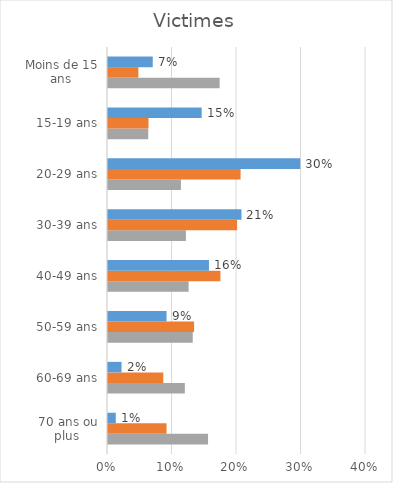
| Category | Victimes  |
|---|---|
| 70 ans ou plus  | 0.012 |
| 60-69 ans | 0.021 |
| 50-59 ans | 0.091 |
| 40-49 ans | 0.157 |
| 30-39 ans | 0.207 |
| 20-29 ans | 0.298 |
| 15-19 ans | 0.145 |
| Moins de 15 ans | 0.069 |